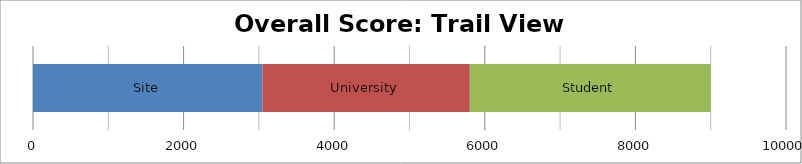
| Category | Site | University | Student |
|---|---|---|---|
| 0 | 3047.5 | 2753.75 | 3200 |